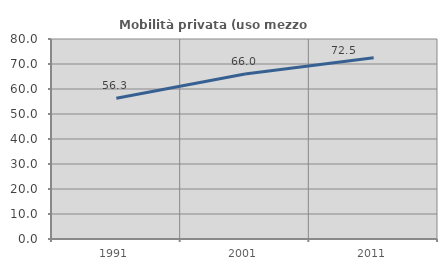
| Category | Mobilità privata (uso mezzo privato) |
|---|---|
| 1991.0 | 56.33 |
| 2001.0 | 65.982 |
| 2011.0 | 72.475 |